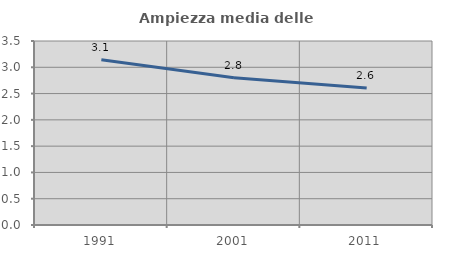
| Category | Ampiezza media delle famiglie |
|---|---|
| 1991.0 | 3.142 |
| 2001.0 | 2.8 |
| 2011.0 | 2.605 |